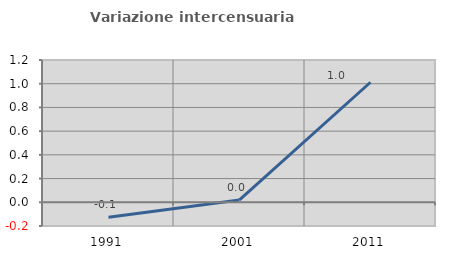
| Category | Variazione intercensuaria annua |
|---|---|
| 1991.0 | -0.126 |
| 2001.0 | 0.02 |
| 2011.0 | 1.012 |